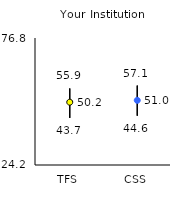
| Category | 25th | 75th | Mean |
|---|---|---|---|
| TFS | 43.7 | 55.9 | 50.22 |
| CSS | 44.6 | 57.1 | 50.98 |